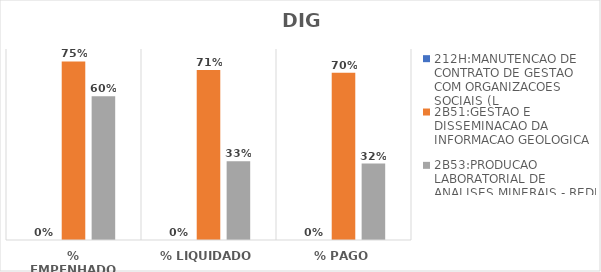
| Category | 212H:MANUTENCAO DE CONTRATO DE GESTAO COM ORGANIZACOES SOCIAIS (L | 2B51:GESTAO E DISSEMINACAO DA INFORMACAO GEOLOGICA | 2B53:PRODUCAO LABORATORIAL DE ANALISES MINERAIS - REDE LAMIN |
|---|---|---|---|
| % EMPENHADO | 0 | 0.748 | 0.602 |
| % LIQUIDADO | 0 | 0.712 | 0.329 |
| % PAGO | 0 | 0.7 | 0.32 |